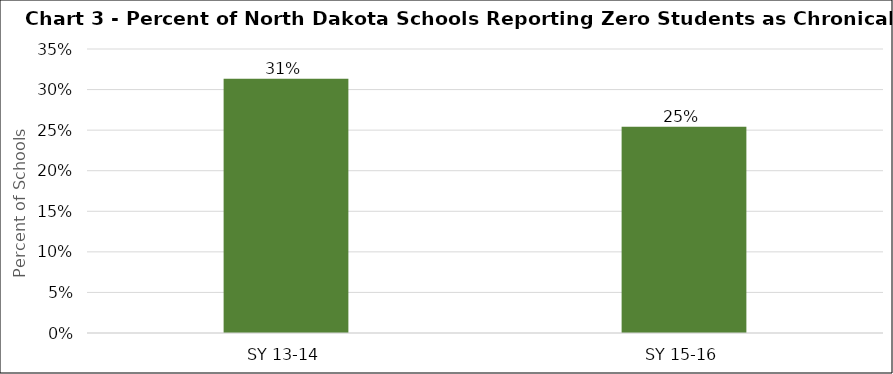
| Category | Series 0 |
|---|---|
| SY 13-14 | 0.313 |
| SY 15-16 | 0.254 |